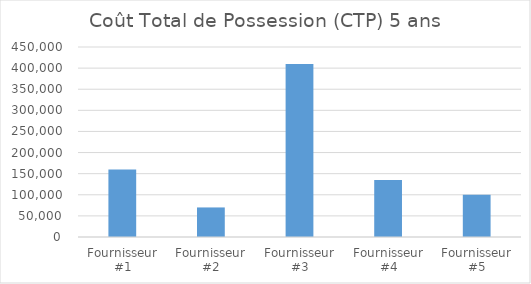
| Category | Coût Total de Possession (CTP) 5 ans |
|---|---|
| Fournisseur #1 | 160000 |
| Fournisseur #2 | 70000 |
| Fournisseur #3 | 410000 |
| Fournisseur #4 | 135000 |
| Fournisseur #5 | 100000 |